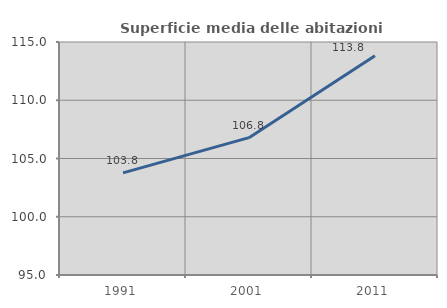
| Category | Superficie media delle abitazioni occupate |
|---|---|
| 1991.0 | 103.765 |
| 2001.0 | 106.789 |
| 2011.0 | 113.819 |